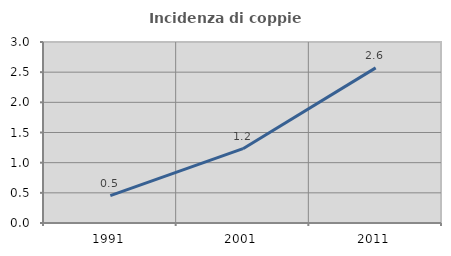
| Category | Incidenza di coppie miste |
|---|---|
| 1991.0 | 0.454 |
| 2001.0 | 1.232 |
| 2011.0 | 2.571 |